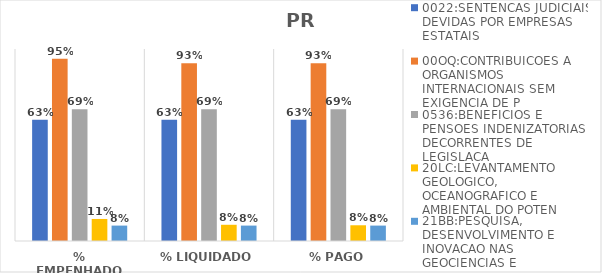
| Category | 0022:SENTENCAS JUDICIAIS DEVIDAS POR EMPRESAS ESTATAIS | 00OQ:CONTRIBUICOES A ORGANISMOS INTERNACIONAIS SEM EXIGENCIA DE P | 0536:BENEFICIOS E PENSOES INDENIZATORIAS DECORRENTES DE LEGISLACA | 20LC:LEVANTAMENTO GEOLOGICO, OCEANOGRAFICO E AMBIENTAL DO POTEN | 21BB:PESQUISA, DESENVOLVIMENTO E INOVACAO NAS GEOCIENCIAS E |
|---|---|---|---|---|---|
| % EMPENHADO | 0.631 | 0.95 | 0.687 | 0.115 | 0.08 |
| % LIQUIDADO | 0.631 | 0.926 | 0.687 | 0.084 | 0.08 |
| % PAGO | 0.631 | 0.926 | 0.687 | 0.082 | 0.08 |